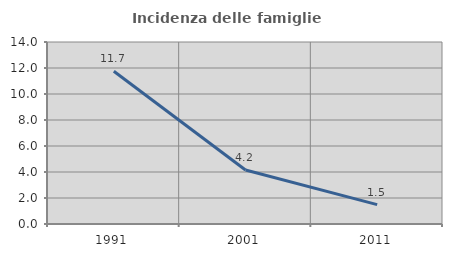
| Category | Incidenza delle famiglie numerose |
|---|---|
| 1991.0 | 11.749 |
| 2001.0 | 4.152 |
| 2011.0 | 1.487 |